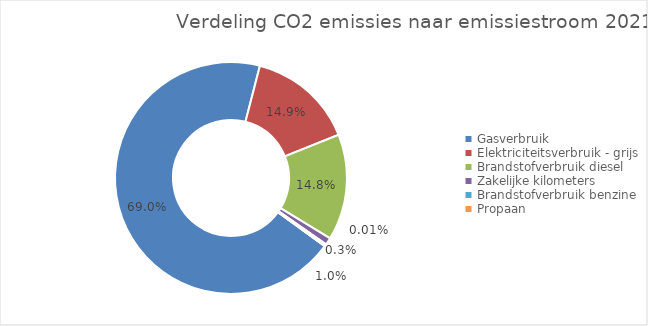
| Category | categorie |
|---|---|
| Gasverbruik | 2842.014 |
| Elektriciteitsverbruik - grijs | 613.814 |
| Brandstofverbruik diesel | 609.155 |
| Zakelijke kilometers | 40.906 |
| Brandstofverbruik benzine | 11.534 |
| Propaan | 0.588 |